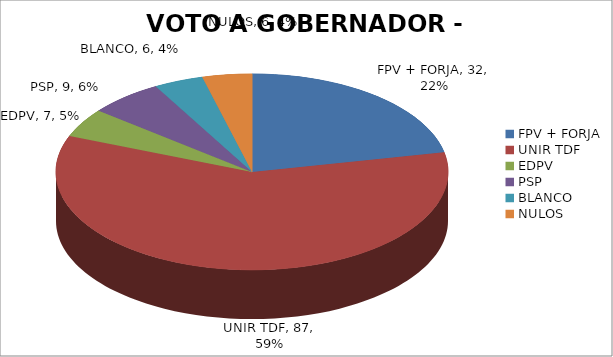
| Category | ANTARTIDA |
|---|---|
| FPV + FORJA | 32 |
| UNIR TDF | 87 |
| EDPV | 7 |
| PSP | 9 |
| BLANCO | 6 |
| NULOS | 6 |